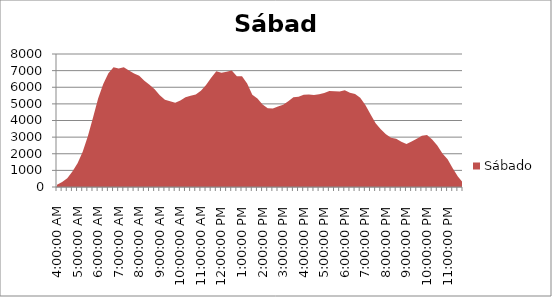
| Category | Sábado |
|---|---|
| 0.16666666666666663 | 138 |
| 0.1770833333333333 | 302 |
| 0.18749999999999994 | 528 |
| 0.1979166666666666 | 933 |
| 0.20833333333333326 | 1423 |
| 0.21874999999999992 | 2126 |
| 0.22916666666666657 | 3047 |
| 0.23958333333333323 | 4159 |
| 0.2499999999999999 | 5321 |
| 0.2604166666666666 | 6193 |
| 0.27083333333333326 | 6849 |
| 0.28124999999999994 | 7199 |
| 0.29166666666666663 | 7126 |
| 0.3020833333333333 | 7209 |
| 0.3125 | 7014 |
| 0.3229166666666667 | 6832 |
| 0.33333333333333337 | 6695 |
| 0.34375000000000006 | 6387 |
| 0.35416666666666674 | 6145 |
| 0.3645833333333334 | 5880 |
| 0.3750000000000001 | 5512 |
| 0.3854166666666668 | 5253 |
| 0.3958333333333335 | 5154 |
| 0.40625000000000017 | 5071 |
| 0.41666666666666685 | 5202 |
| 0.42708333333333354 | 5397 |
| 0.4375000000000002 | 5489 |
| 0.4479166666666669 | 5567 |
| 0.4583333333333336 | 5783 |
| 0.4687500000000003 | 6139 |
| 0.47916666666666696 | 6569 |
| 0.48958333333333365 | 6963 |
| 0.5000000000000003 | 6866 |
| 0.510416666666667 | 6937 |
| 0.5208333333333336 | 7006 |
| 0.5312500000000002 | 6667 |
| 0.5416666666666669 | 6667 |
| 0.5520833333333335 | 6225 |
| 0.5625000000000001 | 5554 |
| 0.5729166666666667 | 5317 |
| 0.5833333333333334 | 4961 |
| 0.59375 | 4734 |
| 0.6041666666666666 | 4722 |
| 0.6145833333333333 | 4835 |
| 0.6249999999999999 | 4947 |
| 0.6354166666666665 | 5152 |
| 0.6458333333333331 | 5401 |
| 0.6562499999999998 | 5422 |
| 0.6666666666666664 | 5543 |
| 0.677083333333333 | 5571 |
| 0.6874999999999997 | 5530 |
| 0.6979166666666663 | 5582 |
| 0.7083333333333329 | 5653 |
| 0.7187499999999996 | 5779 |
| 0.7291666666666662 | 5755 |
| 0.7395833333333328 | 5746 |
| 0.7499999999999994 | 5820 |
| 0.7604166666666661 | 5665 |
| 0.7708333333333327 | 5591 |
| 0.7812499999999993 | 5375 |
| 0.791666666666666 | 4925 |
| 0.8020833333333326 | 4374 |
| 0.8124999999999992 | 3837 |
| 0.8229166666666659 | 3481 |
| 0.8333333333333325 | 3176 |
| 0.8437499999999991 | 2967 |
| 0.8541666666666657 | 2903 |
| 0.8645833333333324 | 2720 |
| 0.874999999999999 | 2586 |
| 0.8854166666666656 | 2732 |
| 0.8958333333333323 | 2900 |
| 0.9062499999999989 | 3078 |
| 0.9166666666666655 | 3121 |
| 0.9270833333333321 | 2855 |
| 0.9374999999999988 | 2492 |
| 0.9479166666666654 | 2013 |
| 0.958333333333332 | 1675 |
| 0.9687499999999987 | 1130 |
| 0.9791666666666653 | 636 |
| 0.9895833333333319 | 262 |